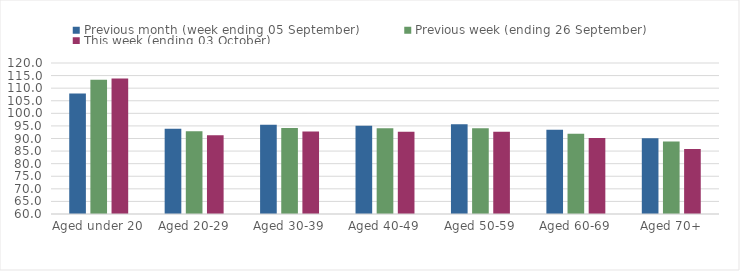
| Category | Previous month (week ending 05 September) | Previous week (ending 26 September) | This week (ending 03 October) |
|---|---|---|---|
| Aged under 20 | 107.84 | 113.33 | 113.82 |
| Aged 20-29 | 93.83 | 92.87 | 91.31 |
| Aged 30-39 | 95.44 | 94.13 | 92.78 |
| Aged 40-49 | 95.11 | 94.05 | 92.7 |
| Aged 50-59 | 95.66 | 94.11 | 92.73 |
| Aged 60-69 | 93.5 | 91.87 | 90.24 |
| Aged 70+ | 90.13 | 88.84 | 85.84 |